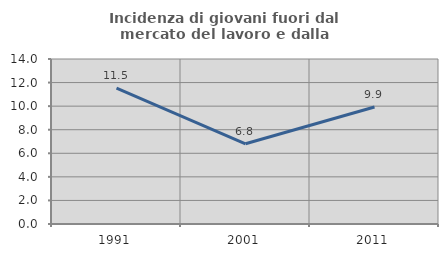
| Category | Incidenza di giovani fuori dal mercato del lavoro e dalla formazione  |
|---|---|
| 1991.0 | 11.538 |
| 2001.0 | 6.809 |
| 2011.0 | 9.929 |